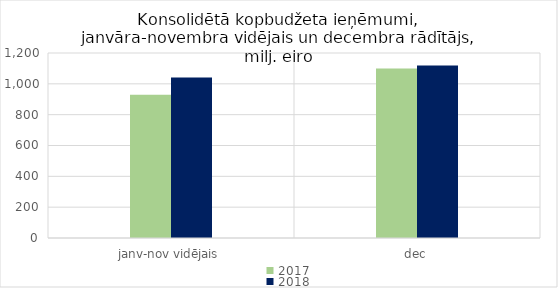
| Category | 2017 | 2018 |
|---|---|---|
| janv-nov vidējais | 929242.433 | 1041217.7 |
| dec | 1098839.178 | 1118858.021 |